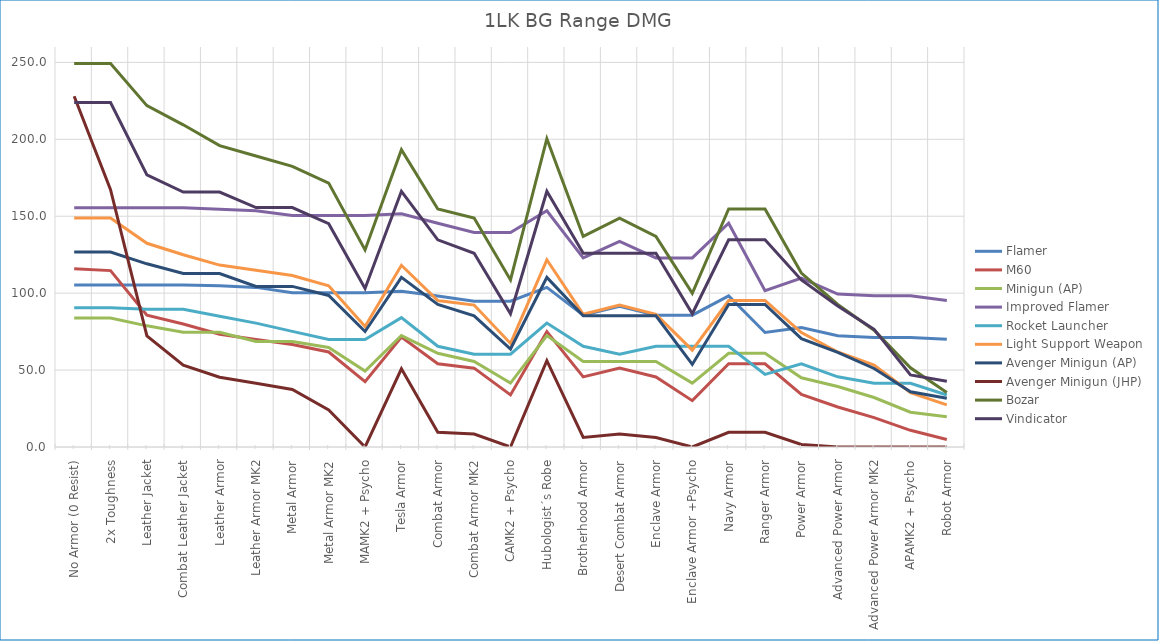
| Category | Flamer | M60 | Minigun (AP) | Improved Flamer | Rocket Launcher | Light Support Weapon | Avenger Minigun (AP) | Avenger Minigun (JHP) | Bozar | Vindicator |
|---|---|---|---|---|---|---|---|---|---|---|
| No Armor (0 Resist) | 105.29 | 115.82 | 83.78 | 155.56 | 90.48 | 148.79 | 126.67 | 228.01 | 249.33 | 223.94 |
| 2x Toughness | 105.29 | 114.66 | 83.78 | 155.56 | 90.48 | 148.79 | 126.67 | 167.21 | 249.33 | 223.94 |
| Leather Jacket | 105.29 | 85.7 | 78.75 | 155.56 | 89.58 | 132.42 | 119.07 | 72.2 | 221.9 | 176.91 |
| Combat Leather Jacket | 105.29 | 79.91 | 74.56 | 155.56 | 89.58 | 124.99 | 112.74 | 53.2 | 209.43 | 165.72 |
| Leather Armor | 104.74 | 73.25 | 74.56 | 154.51 | 85.05 | 118.23 | 112.7 | 45.32 | 195.92 | 165.7 |
| Leather Armor MK2 | 103.75 | 69.91 | 68.6 | 153.51 | 80.53 | 114.85 | 104.39 | 41.38 | 189.17 | 155.67 |
| Metal Armor | 100.27 | 66.59 | 68.6 | 150.54 | 75.16 | 111.47 | 104.4 | 37.44 | 182.41 | 155.67 |
| Metal Armor MK2 | 100.27 | 61.77 | 64.74 | 150.54 | 69.89 | 104.84 | 98.52 | 24.07 | 171.55 | 145.15 |
| MAMK2 + Psycho | 100.27 | 42.47 | 49.33 | 150.54 | 69.89 | 78.3 | 75.07 | 0 | 128.12 | 103.08 |
| Tesla Armor | 101.27 | 71.42 | 72.45 | 151.54 | 84.11 | 118.11 | 110.25 | 50.81 | 193.27 | 166.19 |
| Combat Armor | 98.2 | 54.1 | 60.89 | 145.45 | 65.47 | 95.23 | 92.66 | 9.57 | 154.74 | 134.64 |
| Combat Armor MK2 | 94.74 | 51.25 | 55.6 | 139.48 | 60.35 | 92.25 | 85.25 | 8.44 | 148.79 | 125.95 |
| CAMK2 + Psycho | 94.74 | 33.88 | 41.52 | 139.48 | 60.35 | 67.32 | 63.67 | 0 | 108.58 | 86.59 |
| Hubologist´s Robe | 103.75 | 74.99 | 72.45 | 153.51 | 80.53 | 121.69 | 110.25 | 56.16 | 200.43 | 166.19 |
| Brotherhood Armor | 85.71 | 45.55 | 55.6 | 122.91 | 65.47 | 86.3 | 85.25 | 6.19 | 136.89 | 125.95 |
| Desert Combat Armor | 91.38 | 51.25 | 55.6 | 133.6 | 60.35 | 92.25 | 85.25 | 8.44 | 148.79 | 125.95 |
| Enclave Armor | 85.71 | 45.55 | 55.6 | 122.91 | 65.47 | 86.3 | 85.25 | 6.19 | 136.89 | 125.95 |
| Enclave Armor +Psycho | 85.71 | 30.11 | 41.52 | 122.91 | 65.47 | 62.98 | 53.67 | 0 | 99.89 | 86.59 |
| Navy Armor | 98.2 | 54.1 | 60.89 | 145.45 | 65.47 | 95.23 | 92.66 | 9.57 | 154.74 | 134.64 |
| Ranger Armor | 74.43 | 54.1 | 60.89 | 101.57 | 47.23 | 95.23 | 92.66 | 9.57 | 154.74 | 134.64 |
| Power Armor | 77.67 | 34.17 | 45.01 | 109.84 | 54.05 | 74.4 | 70.42 | 1.69 | 113.08 | 108.58 |
| Advanced Power Armor | 72.26 | 26.01 | 39.31 | 99.4 | 45.6 | 61.77 | 61.51 | 0 | 92.65 | 91.61 |
| Advanced Power Armor MK2 | 71.17 | 19.11 | 32.17 | 98.32 | 41.38 | 53.2 | 51.04 | 0 | 75.92 | 76.48 |
| APAMK2 + Psycho | 71.17 | 10.86 | 22.62 | 98.32 | 41.38 | 35.39 | 35.89 | 0 | 51.47 | 46.82 |
| Robot Armor | 70.11 | 4.83 | 19.6 | 95.24 | 33.78 | 27.35 | 31.67 | 0 | 35.39 | 42.75 |